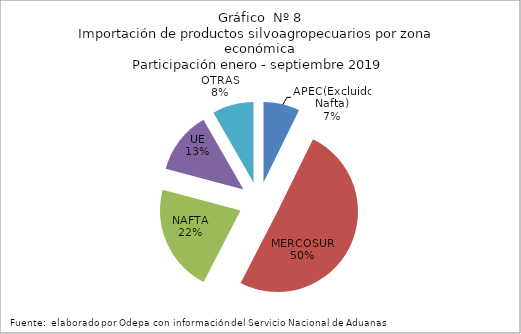
| Category | Series 0 |
|---|---|
| APEC(Excluido Nafta) | 349115.809 |
| MERCOSUR | 2416689.799 |
| NAFTA | 1035529.591 |
| UE | 604051.299 |
| OTRAS | 398578.503 |